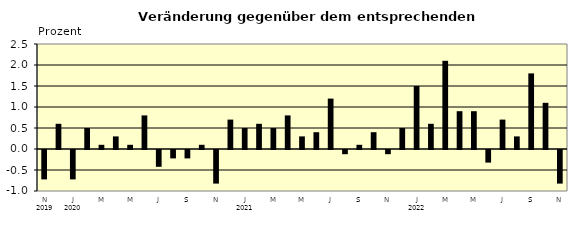
| Category | Series 0 |
|---|---|
| 0 | -0.7 |
| 1 | 0.6 |
| 2 | -0.7 |
| 3 | 0.5 |
| 4 | 0.1 |
| 5 | 0.3 |
| 6 | 0.1 |
| 7 | 0.8 |
| 8 | -0.4 |
| 9 | -0.2 |
| 10 | -0.2 |
| 11 | 0.1 |
| 12 | -0.8 |
| 13 | 0.7 |
| 14 | 0.5 |
| 15 | 0.6 |
| 16 | 0.5 |
| 17 | 0.8 |
| 18 | 0.3 |
| 19 | 0.4 |
| 20 | 1.2 |
| 21 | -0.1 |
| 22 | 0.1 |
| 23 | 0.4 |
| 24 | -0.1 |
| 25 | 0.5 |
| 26 | 1.5 |
| 27 | 0.6 |
| 28 | 2.1 |
| 29 | 0.9 |
| 30 | 0.9 |
| 31 | -0.3 |
| 32 | 0.7 |
| 33 | 0.3 |
| 34 | 1.8 |
| 35 | 1.1 |
| 36 | -0.8 |